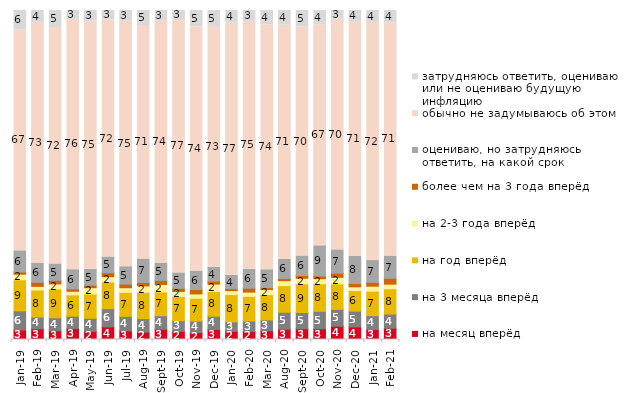
| Category | на месяц вперёд | на 3 месяца вперёд | на год вперёд | на 2-3 года вперёд | более чем на 3 года вперёд | оцениваю, но затрудняюсь ответить, на какой срок | обычно не задумываюсь об этом | затрудняюсь ответить, оцениваю или не оцениваю будущую инфляцию |
|---|---|---|---|---|---|---|---|---|
| 2019-01-01 | 2.9 | 5.8 | 9.45 | 1.7 | 0.65 | 6.45 | 67.1 | 5.95 |
| 2019-02-01 | 3.25 | 3.55 | 8.25 | 1.1 | 1.25 | 5.8 | 73.05 | 3.75 |
| 2019-03-01 | 2.636 | 3.978 | 8.752 | 1.542 | 1.094 | 4.973 | 71.855 | 5.172 |
| 2019-04-01 | 3.366 | 3.713 | 6.485 | 1.089 | 0.743 | 5.842 | 76.089 | 2.673 |
| 2019-05-01 | 2.476 | 3.962 | 7.38 | 1.932 | 0.743 | 4.854 | 75.433 | 3.219 |
| 2019-06-01 | 3.84 | 5.536 | 8.13 | 1.596 | 1.197 | 4.788 | 71.97 | 2.943 |
| 2019-07-01 | 2.624 | 4.406 | 7.277 | 1.436 | 1.089 | 5.297 | 74.653 | 3.218 |
| 2019-08-01 | 2.248 | 4.096 | 7.992 | 1.948 | 1.049 | 7.143 | 70.929 | 4.595 |
| 2019-09-01 | 3.119 | 4.109 | 7.228 | 2.277 | 1.238 | 5.248 | 73.515 | 3.267 |
| 2019-10-01 | 2.475 | 3.267 | 7.327 | 1.535 | 0.941 | 4.703 | 76.832 | 2.921 |
| 2019-11-01 | 2.079 | 3.515 | 6.931 | 1.337 | 1.337 | 5.594 | 74.257 | 4.95 |
| 2019-12-01 | 3.069 | 4.01 | 7.525 | 2.228 | 0.891 | 4.257 | 73.119 | 4.901 |
| 2020-01-01 | 2.475 | 2.871 | 8.317 | 1.188 | 0.594 | 4.059 | 76.782 | 3.713 |
| 2020-02-01 | 2.426 | 3.218 | 7.475 | 1.287 | 1.188 | 5.743 | 75.396 | 3.267 |
| 2020-03-01 | 2.628 | 3.322 | 7.685 | 1.537 | 0.595 | 5.454 | 74.467 | 4.313 |
| 2020-08-01 | 3.128 | 5.164 | 8.093 | 1.49 | 0.645 | 5.909 | 71.102 | 4.469 |
| 2020-09-01 | 3.235 | 4.978 | 8.711 | 1.692 | 0.796 | 5.973 | 69.587 | 5.027 |
| 2020-10-01 | 3.239 | 5.331 | 8.371 | 1.545 | 0.797 | 9.218 | 67.165 | 4.335 |
| 2020-11-01 | 4.05 | 5.1 | 7.75 | 2 | 1.25 | 7.1 | 70.1 | 2.65 |
| 2020-12-01 | 3.818 | 4.809 | 6.247 | 1.14 | 0.992 | 8.329 | 71.145 | 3.52 |
| 2021-01-01 | 3.03 | 4.223 | 7.452 | 1.49 | 1.192 | 6.607 | 72.33 | 3.676 |
| 2021-02-01 | 3.424 | 4.318 | 7.692 | 1.39 | 1.787 | 6.749 | 70.868 | 3.772 |